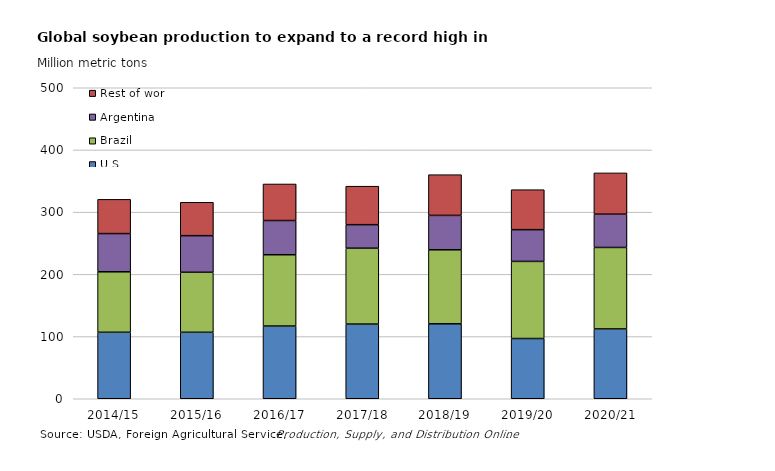
| Category | U.S. | Brazil | Argentina | Rest of world |
|---|---|---|---|---|
| 2014/15 | 106.905 | 97.2 | 61.45 | 55.034 |
| 2015/16 | 106.869 | 96.5 | 58.8 | 53.728 |
| 2016/17 | 116.931 | 114.6 | 55 | 58.767 |
| 2017/18 | 120.065 | 122 | 37.8 | 61.879 |
| 2018/19 | 120.515 | 119 | 55.3 | 65.442 |
| 2019/20 | 96.841 | 124 | 51 | 64.321 |
| 2020/21 | 112.264 | 131 | 53.5 | 66.343 |